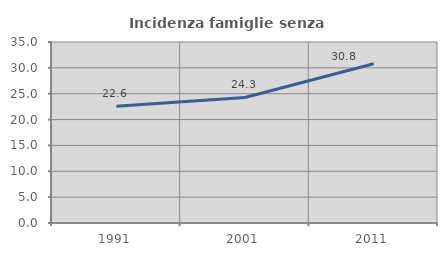
| Category | Incidenza famiglie senza nuclei |
|---|---|
| 1991.0 | 22.564 |
| 2001.0 | 24.272 |
| 2011.0 | 30.805 |